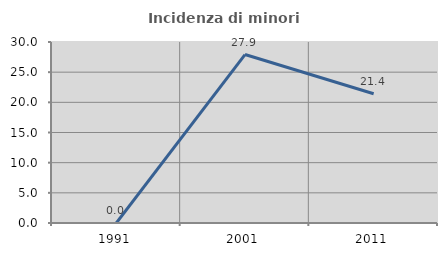
| Category | Incidenza di minori stranieri |
|---|---|
| 1991.0 | 0 |
| 2001.0 | 27.922 |
| 2011.0 | 21.413 |